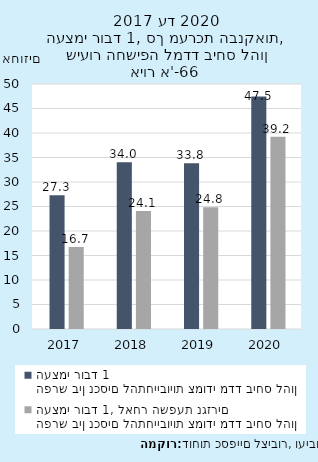
| Category | הפרש בין נכסים להתחייבויות צמודי מדד ביחס להון העצמי רובד 1 | הפרש בין נכסים להתחייבויות צמודי מדד ביחס להון העצמי רובד 1, לאחר השפעת נגזרים |
|---|---|---|
| 2017-12-31 | 27.308 | 16.732 |
| 2018-12-31 | 34.042 | 24.096 |
| 2019-12-31 | 33.846 | 24.835 |
| 2020-12-31 | 47.458 | 39.242 |